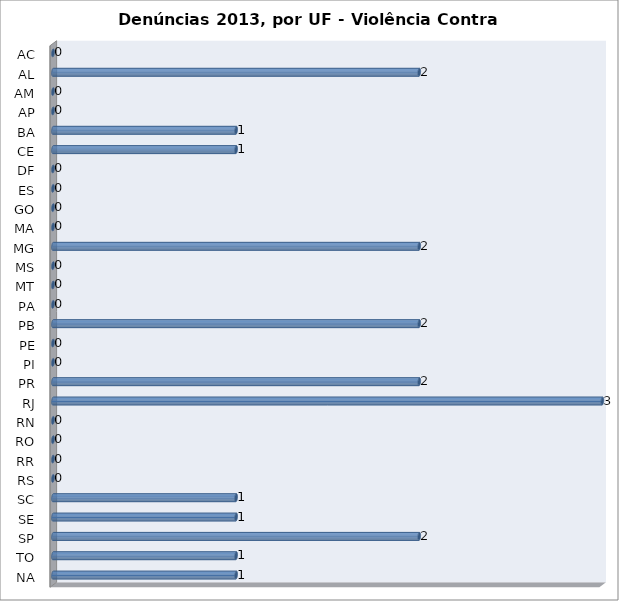
| Category | Series 0 |
|---|---|
| AC | 0 |
| AL | 2 |
| AM | 0 |
| AP | 0 |
| BA | 1 |
| CE | 1 |
| DF | 0 |
| ES | 0 |
| GO | 0 |
| MA | 0 |
| MG | 2 |
| MS | 0 |
| MT | 0 |
| PA | 0 |
| PB | 2 |
| PE | 0 |
| PI | 0 |
| PR | 2 |
| RJ | 3 |
| RN | 0 |
| RO | 0 |
| RR | 0 |
| RS | 0 |
| SC | 1 |
| SE | 1 |
| SP | 2 |
| TO | 1 |
| NA | 1 |